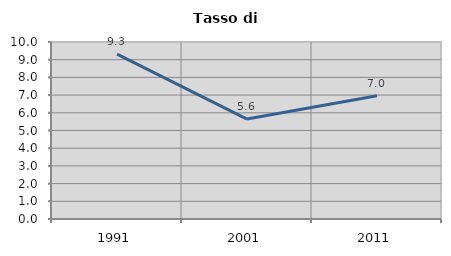
| Category | Tasso di disoccupazione   |
|---|---|
| 1991.0 | 9.311 |
| 2001.0 | 5.648 |
| 2011.0 | 6.958 |